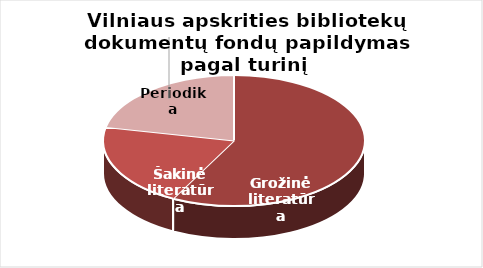
| Category | Series 0 |
|---|---|
| Grožinė literatūra | 48721 |
| Šakinė literatūra | 17439 |
| Periodika | 18304 |